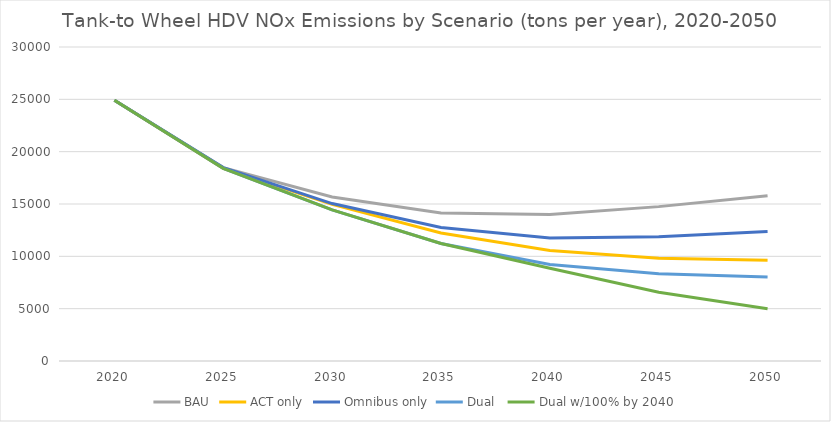
| Category | BAU | ACT only | Omnibus only | Dual  | Dual w/100% by 2040 |
|---|---|---|---|---|---|
| 2020.0 | 24903.934 | 24903.934 | 24903.934 | 24903.934 | 24903.934 |
| 2025.0 | 18479.77 | 18403.773 | 18479.77 | 18403.773 | 18403.773 |
| 2030.0 | 15662.195 | 14968.317 | 15042.265 | 14440.032 | 14440.032 |
| 2035.0 | 14145.33 | 12222.445 | 12746.799 | 11229.755 | 11229.755 |
| 2040.0 | 13987.44 | 10548.443 | 11754.082 | 9212.165 | 8864.168 |
| 2045.0 | 14749.518 | 9818.372 | 11862.387 | 8327.692 | 6576.418 |
| 2050.0 | 15792.557 | 9627.903 | 12381.027 | 8029.475 | 4999.124 |